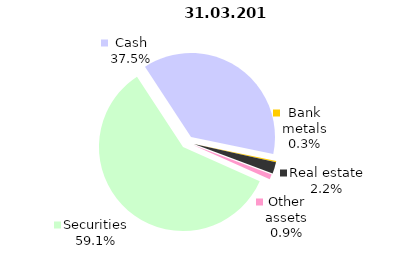
| Category | Total |
|---|---|
| Securities | 842.103 |
| Cash | 533.707 |
| Bank metals | 3.681 |
| Real estate | 31.721 |
| Other assets | 13.508 |